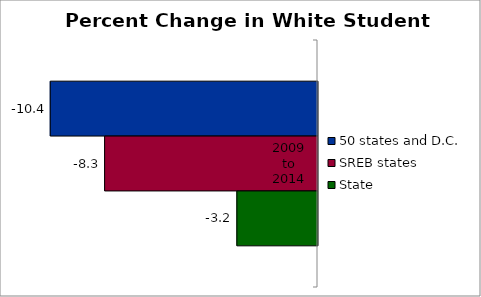
| Category | 50 states and D.C. | SREB states | State |
|---|---|---|---|
| 2009 to
2014 | -10.447 | -8.321 | -3.152 |